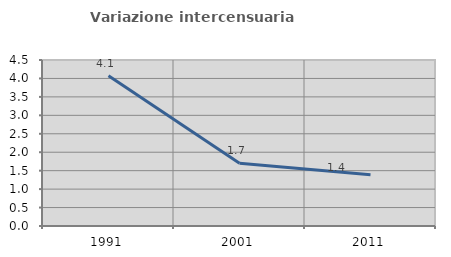
| Category | Variazione intercensuaria annua |
|---|---|
| 1991.0 | 4.076 |
| 2001.0 | 1.7 |
| 2011.0 | 1.391 |